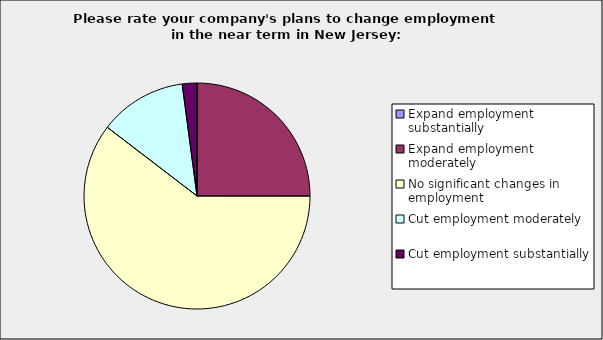
| Category | Series 0 |
|---|---|
| Expand employment substantially | 0 |
| Expand employment moderately | 0.25 |
| No significant changes in employment | 0.604 |
| Cut employment moderately | 0.125 |
| Cut employment substantially | 0.021 |